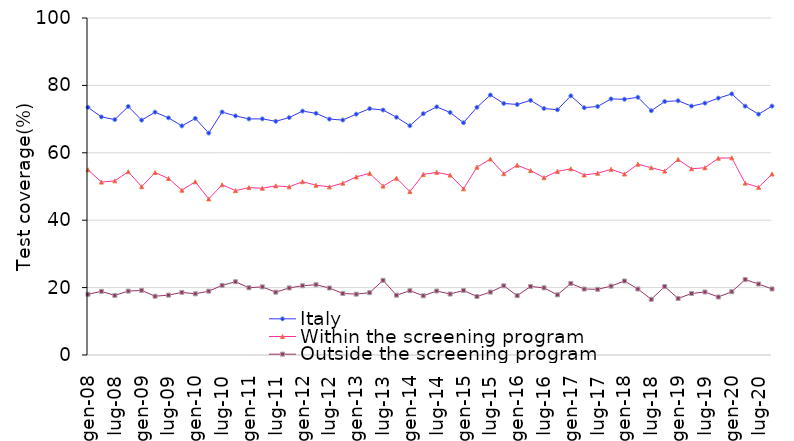
| Category | Italy | Within the screening program | Outside the screening program |
|---|---|---|---|
| gen-08 | 73.488 | 54.967 | 18.019 |
| apr-08 | 70.65 | 51.313 | 18.887 |
| lug-08 | 69.855 | 51.672 | 17.683 |
| ott-08 | 73.737 | 54.378 | 18.961 |
| gen-09 | 69.698 | 49.947 | 19.179 |
| apr-09 | 72.05 | 54.143 | 17.437 |
| lug-09 | 70.375 | 52.372 | 17.763 |
| ott-09 | 67.987 | 48.918 | 18.581 |
| gen-10 | 70.198 | 51.407 | 18.159 |
| apr-10 | 65.86 | 46.313 | 18.947 |
| lug-10 | 72.105 | 50.502 | 20.663 |
| ott-10 | 70.947 | 48.768 | 21.731 |
| gen-11 | 70.048 | 49.667 | 19.959 |
| apr-11 | 70.07 | 49.483 | 20.217 |
| lug-11 | 69.355 | 50.182 | 18.643 |
| ott-11 | 70.437 | 49.908 | 19.901 |
| gen-12 | 72.378 | 51.427 | 20.549 |
| apr-12 | 71.71 | 50.383 | 20.867 |
| lug-12 | 70.005 | 49.892 | 19.873 |
| ott-12 | 69.717 | 50.998 | 18.261 |
| gen-13 | 71.468 | 52.847 | 18.059 |
| apr-13 | 73.1 | 53.903 | 18.487 |
| lug-13 | 72.695 | 50.112 | 22.163 |
| ott-13 | 70.547 | 52.478 | 17.751 |
| gen-14 | 68.038 | 48.477 | 19.079 |
| apr-14 | 71.61 | 53.563 | 17.577 |
| lug-14 | 73.625 | 54.212 | 18.993 |
| ott-14 | 71.967 | 53.388 | 18.091 |
| gen-15 | 68.928 | 49.317 | 19.149 |
| apr-15 | 73.5 | 55.743 | 17.347 |
| lug-15 | 77.145 | 58.142 | 18.663 |
| ott-15 | 74.647 | 53.798 | 20.531 |
| gen-16 | 74.338 | 56.317 | 17.609 |
| apr-16 | 75.56 | 54.743 | 20.347 |
| lug-16 | 73.145 | 52.632 | 19.923 |
| ott-16 | 72.777 | 54.488 | 17.851 |
| gen-17 | 76.898 | 55.247 | 21.239 |
| apr-17 | 73.37 | 53.423 | 19.567 |
| lug-17 | 73.755 | 53.932 | 19.493 |
| ott-17 | 75.987 | 55.098 | 20.431 |
| gen-18 | 75.878 | 53.717 | 21.959 |
| apr-18 | 76.47 | 56.633 | 19.587 |
| lug-18 | 72.485 | 55.572 | 16.533 |
| ott-18 | 75.217 | 54.578 | 20.321 |
| gen-19 | 75.438 | 58.037 | 16.779 |
| apr-19 | 73.86 | 55.263 | 18.237 |
| lug-19 | 74.735 | 55.562 | 18.703 |
| ott-19 | 76.217 | 58.398 | 17.211 |
| gen-20 | 77.478 | 58.507 | 18.769 |
| apr-20 | 73.84 | 51.003 | 22.377 |
| lug-20 | 71.465 | 49.772 | 21.063 |
| ott-20 | 73.857 | 53.718 | 19.601 |